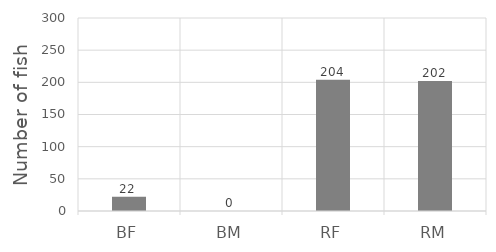
| Category | Series 0 |
|---|---|
| BF | 22 |
| BM | 0 |
| RF | 204 |
| RM | 202 |